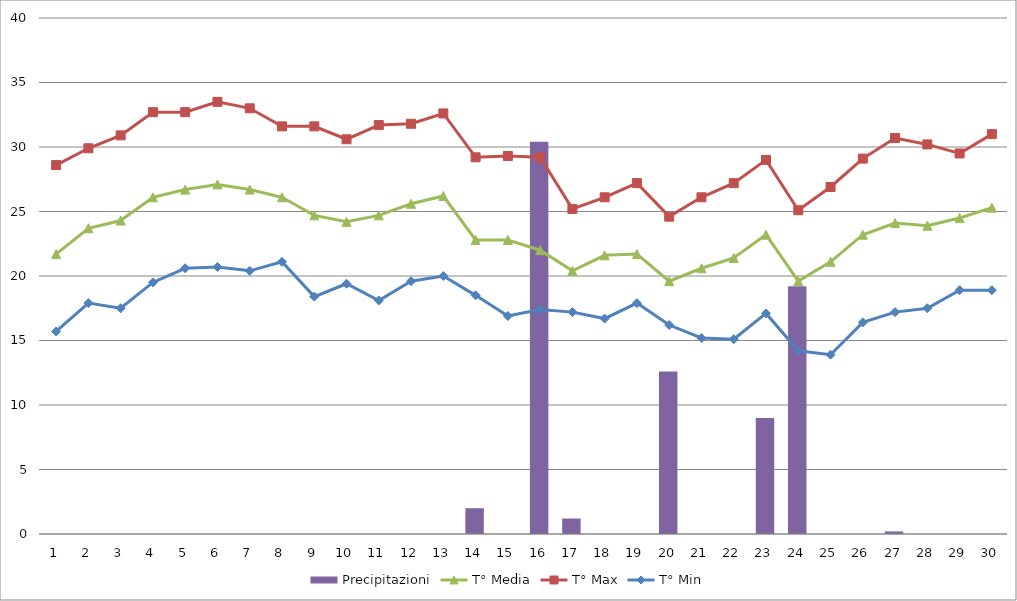
| Category | Precipitazioni |
|---|---|
| 0 | 0 |
| 1 | 0 |
| 2 | 0 |
| 3 | 0 |
| 4 | 0 |
| 5 | 0 |
| 6 | 0 |
| 7 | 0 |
| 8 | 0 |
| 9 | 0 |
| 10 | 0 |
| 11 | 0 |
| 12 | 0 |
| 13 | 2 |
| 14 | 0 |
| 15 | 30.4 |
| 16 | 1.2 |
| 17 | 0 |
| 18 | 0 |
| 19 | 12.6 |
| 20 | 0 |
| 21 | 0 |
| 22 | 9 |
| 23 | 19.2 |
| 24 | 0 |
| 25 | 0 |
| 26 | 0.2 |
| 27 | 0 |
| 28 | 0 |
| 29 | 0 |